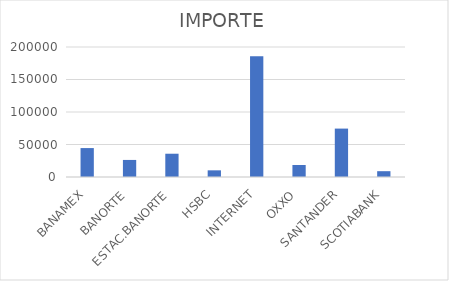
| Category | IMPORTE |
|---|---|
| BANAMEX | 44501.66 |
| BANORTE | 26247.92 |
| ESTAC.BANORTE | 35812.7 |
| HSBC | 10255.6 |
| INTERNET | 185944.87 |
| OXXO | 18453.68 |
| SANTANDER | 74476.56 |
| SCOTIABANK | 8944.83 |